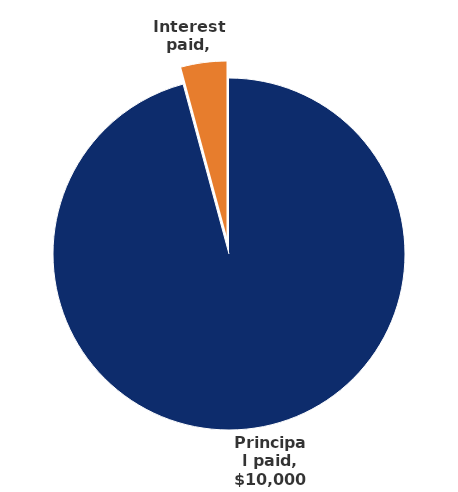
| Category | Series 0 |
|---|---|
| Principal paid | 10000 |
| Interest paid | 438.611 |